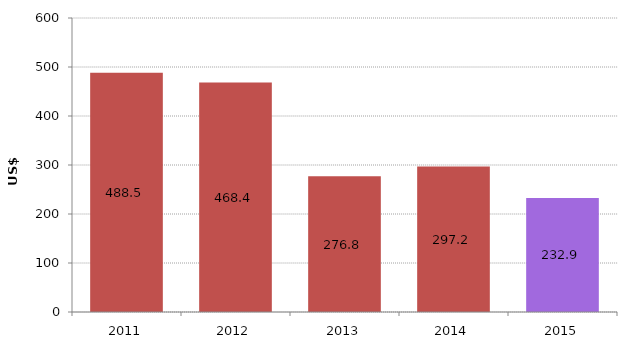
| Category | Series 1 |
|---|---|
| 2011.0 | 488.478 |
| 2012.0 | 468.445 |
| 2013.0 | 276.809 |
| 2014.0 | 297.184 |
| 2015.0 | 232.866 |